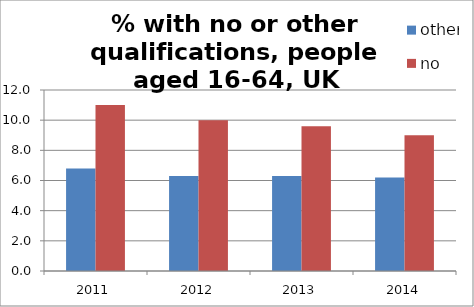
| Category | other | no |
|---|---|---|
| 2011.0 | 6.8 | 11 |
| 2012.0 | 6.3 | 10 |
| 2013.0 | 6.3 | 9.6 |
| 2014.0 | 6.2 | 9 |